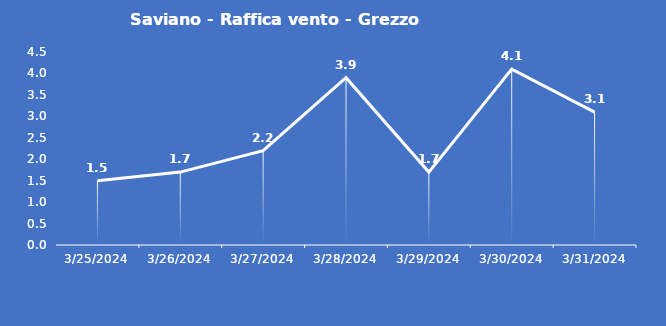
| Category | Saviano - Raffica vento - Grezzo (m/s) |
|---|---|
| 3/25/24 | 1.5 |
| 3/26/24 | 1.7 |
| 3/27/24 | 2.2 |
| 3/28/24 | 3.9 |
| 3/29/24 | 1.7 |
| 3/30/24 | 4.1 |
| 3/31/24 | 3.1 |